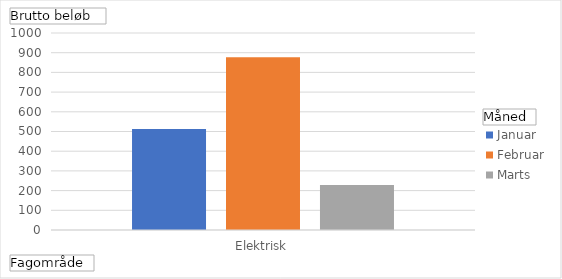
| Category | Januar | Februar | Marts |
|---|---|---|---|
| Elektrisk | 513 | 877 | 228 |